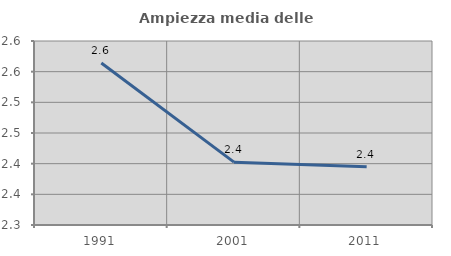
| Category | Ampiezza media delle famiglie |
|---|---|
| 1991.0 | 2.564 |
| 2001.0 | 2.402 |
| 2011.0 | 2.395 |